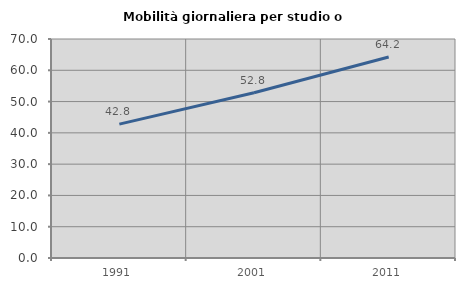
| Category | Mobilità giornaliera per studio o lavoro |
|---|---|
| 1991.0 | 42.781 |
| 2001.0 | 52.802 |
| 2011.0 | 64.238 |